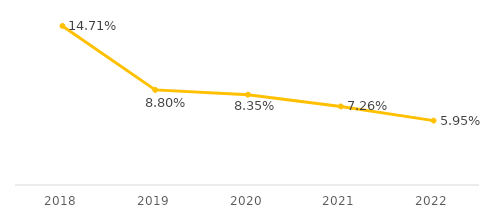
| Category | Costo de viaje (un boleto) en relación al salario mínimo |
|---|---|
| 2018.0 | 0.147 |
| 2019.0 | 0.088 |
| 2020.0 | 0.084 |
| 2021.0 | 0.073 |
| 2022.0 | 0.06 |